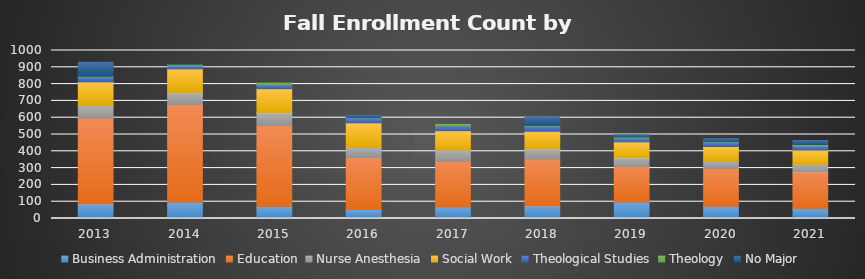
| Category | Business Administration | Education | Nurse Anesthesia | Social Work | Theological Studies | Theology | No Major |
|---|---|---|---|---|---|---|---|
| 2013.0 | 87 | 509 | 76 | 141 | 28 | 6 | 84 |
| 2014.0 | 96 | 582 | 71 | 141 | 19 | 8 | 1 |
| 2015.0 | 71 | 483 | 75 | 143 | 24 | 10 | 0 |
| 2016.0 | 53 | 309 | 62 | 145 | 29 | 3 | 10 |
| 2017.0 | 68 | 273 | 66 | 116 | 27 | 10 | 0 |
| 2018.0 | 75 | 279 | 61 | 104 | 28 | 7 | 51 |
| 2019.0 | 98 | 212 | 51 | 95 | 21 | 8 | 12 |
| 2020.0 | 72 | 225 | 44 | 88 | 23 | 5 | 18 |
| 2021.0 | 59 | 218 | 44 | 86 | 25 | 8 | 25 |